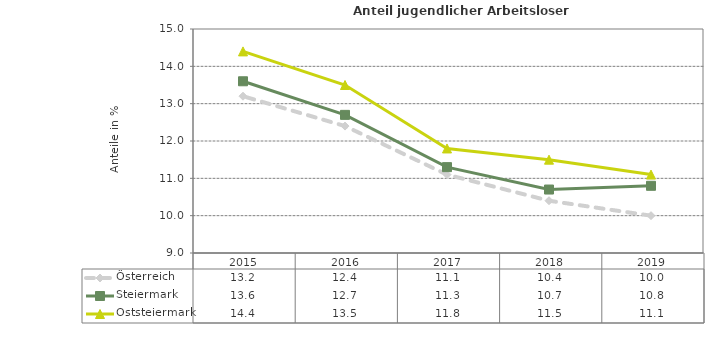
| Category | Österreich | Steiermark | Oststeiermark |
|---|---|---|---|
| 2019.0 | 10 | 10.8 | 11.1 |
| 2018.0 | 10.4 | 10.7 | 11.5 |
| 2017.0 | 11.1 | 11.3 | 11.8 |
| 2016.0 | 12.4 | 12.7 | 13.5 |
| 2015.0 | 13.2 | 13.6 | 14.4 |